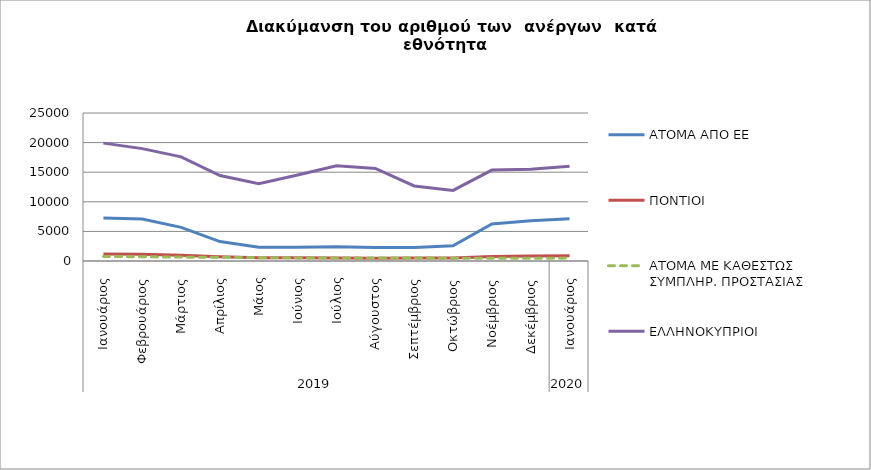
| Category | ΑΤΟΜΑ ΑΠΟ ΕΕ | ΠΟΝΤΙΟΙ | ΑΤΟΜΑ ΜΕ ΚΑΘΕΣΤΩΣ ΣΥΜΠΛΗΡ. ΠΡΟΣΤΑΣΙΑΣ | ΕΛΛΗΝΟΚΥΠΡΙΟΙ |
|---|---|---|---|---|
| 0 | 7269 | 1176 | 765 | 19911 |
| 1 | 7095 | 1145 | 719 | 18983 |
| 2 | 5678 | 963 | 655 | 17591 |
| 3 | 3279 | 709 | 623 | 14429 |
| 4 | 2334 | 556 | 567 | 13066 |
| 5 | 2332 | 537 | 525 | 14520 |
| 6 | 2405 | 513 | 509 | 16081 |
| 7 | 2278 | 474 | 486 | 15644 |
| 8 | 2278 | 504 | 497 | 12674 |
| 9 | 2586 | 518 | 475 | 11921 |
| 10 | 6266 | 775 | 476 | 15352 |
| 11 | 6810 | 834 | 465 | 15490 |
| 12 | 7137 | 866 | 490 | 15998 |